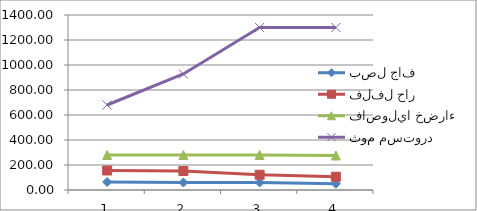
| Category | بصل جاف | فلفل حار | فاصوليا خضراء | ثوم مستورد |
|---|---|---|---|---|
| 0 | 64 | 156 | 280 | 680 |
| 1 | 60 | 152 | 280 | 928 |
| 2 | 60 | 122 | 280 | 1300 |
| 3 | 50 | 106 | 276 | 1300 |